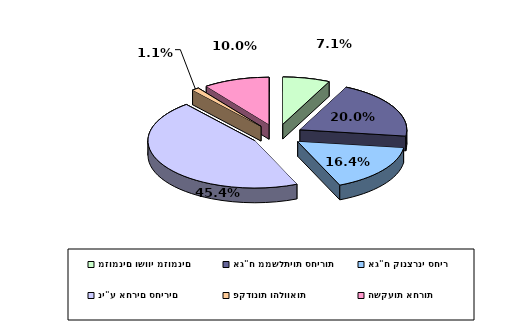
| Category | Series 0 |
|---|---|
| מזומנים ושווי מזומנים | 0.071 |
| אג"ח ממשלתיות סחירות | 0.2 |
| אג"ח קונצרני סחיר | 0.164 |
| ני"ע אחרים סחירים | 0.454 |
| פקדונות והלוואות | 0.011 |
| השקעות אחרות | 0.1 |